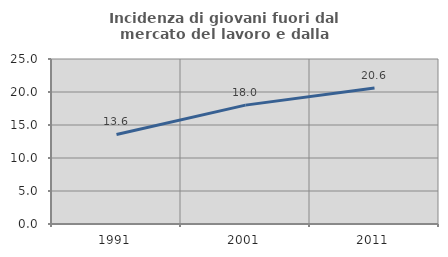
| Category | Incidenza di giovani fuori dal mercato del lavoro e dalla formazione  |
|---|---|
| 1991.0 | 13.568 |
| 2001.0 | 18.012 |
| 2011.0 | 20.611 |